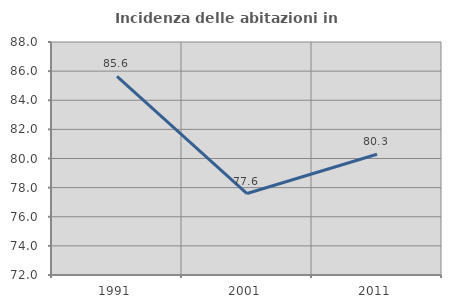
| Category | Incidenza delle abitazioni in proprietà  |
|---|---|
| 1991.0 | 85.632 |
| 2001.0 | 77.596 |
| 2011.0 | 80.288 |